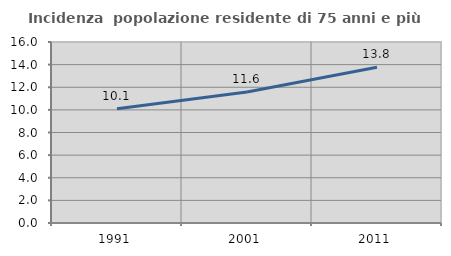
| Category | Incidenza  popolazione residente di 75 anni e più |
|---|---|
| 1991.0 | 10.091 |
| 2001.0 | 11.579 |
| 2011.0 | 13.775 |